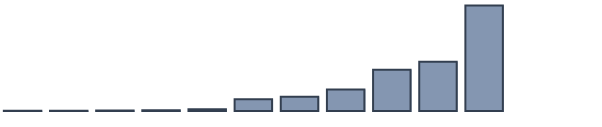
| Category | Series 0 |
|---|---|
| 0 | 0.1 |
| 1 | 0.1 |
| 2 | 0.2 |
| 3 | 0.3 |
| 4 | 0.7 |
| 5 | 4.8 |
| 6 | 5.8 |
| 7 | 8.7 |
| 8 | 16.7 |
| 9 | 20 |
| 10 | 42.8 |
| 11 | 0 |
| 12 | 0 |